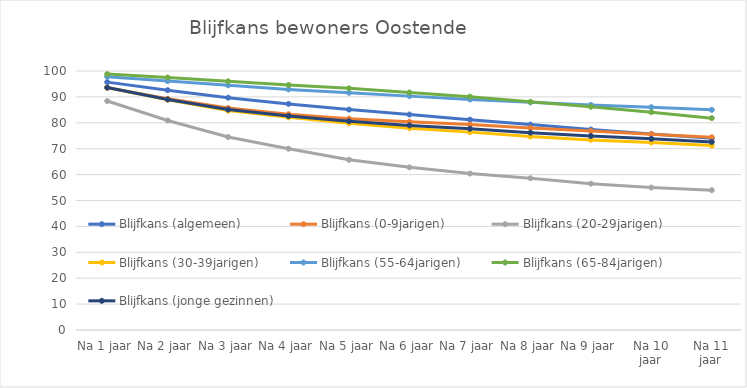
| Category | Blijfkans (algemeen) | Blijfkans (0-9jarigen) | Blijfkans (20-29jarigen) | Blijfkans (30-39jarigen) | Blijfkans (55-64jarigen) | Blijfkans (65-84jarigen) | Blijfkans (jonge gezinnen) |
|---|---|---|---|---|---|---|---|
| Na 1 jaar | 95.7 | 93.5 | 88.4 | 93.6 | 97.8 | 98.8 | 93.6 |
| Na 2 jaar | 92.6 | 89.3 | 80.9 | 88.9 | 96.1 | 97.5 | 89 |
| Na 3 jaar | 89.7 | 85.7 | 74.5 | 84.7 | 94.5 | 96 | 85.1 |
| Na 4 jaar | 87.3 | 83.3 | 70 | 82.1 | 92.9 | 94.6 | 82.6 |
| Na 5 jaar | 85.1 | 81.6 | 65.7 | 79.8 | 91.6 | 93.3 | 80.6 |
| Na 6 jaar | 83.2 | 80.4 | 62.8 | 77.9 | 90.3 | 91.7 | 79 |
| Na 7 jaar | 81.2 | 79.3 | 60.4 | 76.4 | 89 | 90.1 | 77.7 |
| Na 8 jaar | 79.3 | 78 | 58.6 | 74.7 | 87.9 | 88.1 | 76.2 |
| Na 9 jaar | 77.4 | 76.8 | 56.5 | 73.4 | 86.9 | 86.2 | 74.9 |
| Na 10 jaar | 75.7 | 75.6 | 55 | 72.4 | 86 | 84.1 | 73.8 |
| Na 11 jaar | 74 | 74.4 | 54 | 71.2 | 85 | 81.8 | 72.6 |